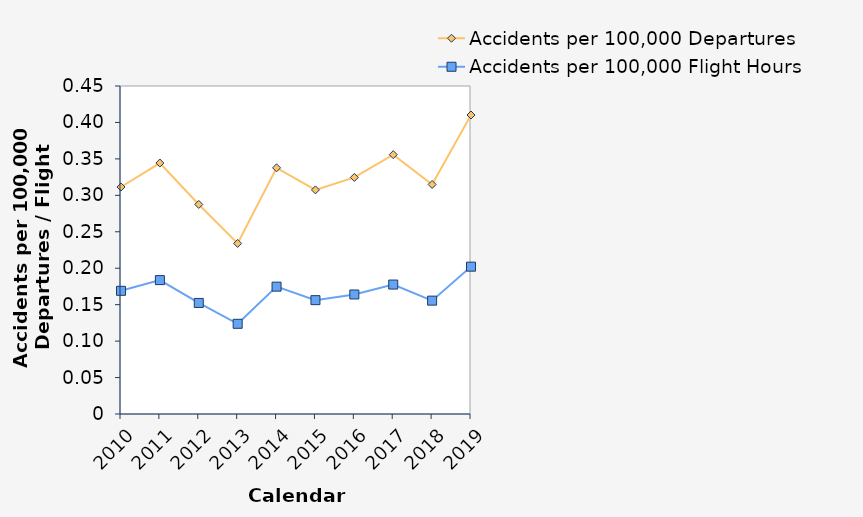
| Category | Accidents per 100,000 Departures | Accidents per 100,000 Flight Hours |
|---|---|---|
| 2010.0 | 0.311 | 0.169 |
| 2011.0 | 0.344 | 0.184 |
| 2012.0 | 0.288 | 0.152 |
| 2013.0 | 0.234 | 0.124 |
| 2014.0 | 0.338 | 0.175 |
| 2015.0 | 0.307 | 0.156 |
| 2016.0 | 0.325 | 0.164 |
| 2017.0 | 0.356 | 0.178 |
| 2018.0 | 0.315 | 0.156 |
| 2019.0 | 0.41 | 0.202 |